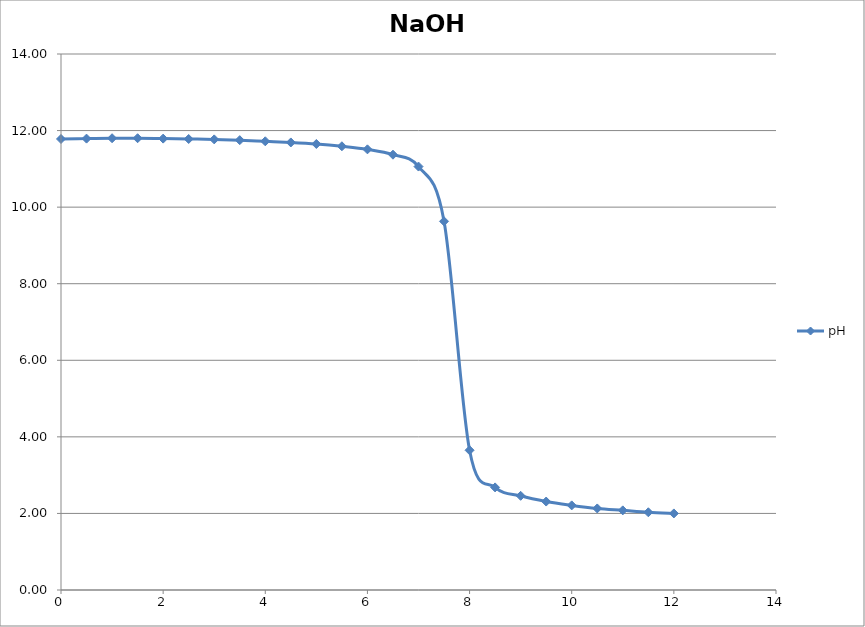
| Category | pH |
|---|---|
| 0.0 | 11.78 |
| 0.5 | 11.79 |
| 1.0 | 11.8 |
| 1.5 | 11.8 |
| 2.0 | 11.79 |
| 2.5 | 11.78 |
| 3.0 | 11.77 |
| 3.5 | 11.75 |
| 4.0 | 11.72 |
| 4.5 | 11.69 |
| 5.0 | 11.65 |
| 5.5 | 11.59 |
| 6.0 | 11.51 |
| 6.5 | 11.37 |
| 7.0 | 11.06 |
| 7.5 | 9.63 |
| 8.0 | 3.65 |
| 8.5 | 2.68 |
| 9.0 | 2.46 |
| 9.5 | 2.31 |
| 10.0 | 2.21 |
| 10.5 | 2.13 |
| 11.0 | 2.08 |
| 11.5 | 2.03 |
| 12.0 | 2 |